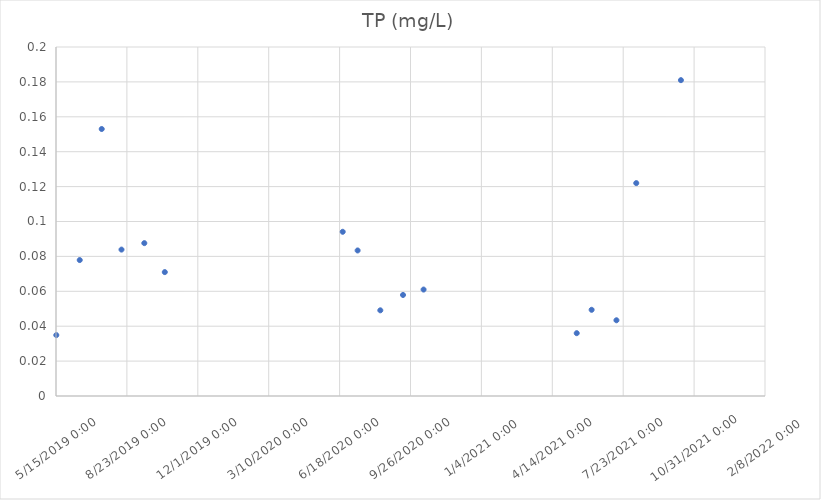
| Category | TP (mg/L) |
|---|---|
| 43600.427083333336 | 0.035 |
| 43633.458333333336 | 0.078 |
| 43664.47222222222 | 0.153 |
| 43692.39097222222 | 0.084 |
| 43724.56527777778 | 0.088 |
| 43753.45416666667 | 0.071 |
| 44004.393055555556 | 0.094 |
| 44025.42986111111 | 0.083 |
| 44057.427083333336 | 0.049 |
| 44089.43819444445 | 0.058 |
| 44118.44652777778 | 0.061 |
| 44334.447916666664 | 0.036 |
| 44355.475694444445 | 0.049 |
| 44390.479166666664 | 0.043 |
| 44418.416666666664 | 0.122 |
| 44481.416666666664 | 0.181 |